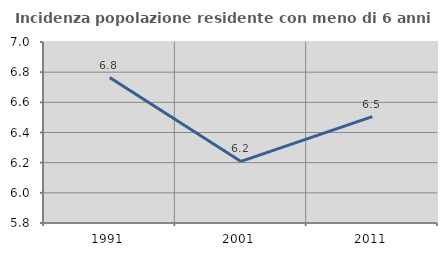
| Category | Incidenza popolazione residente con meno di 6 anni |
|---|---|
| 1991.0 | 6.764 |
| 2001.0 | 6.208 |
| 2011.0 | 6.505 |